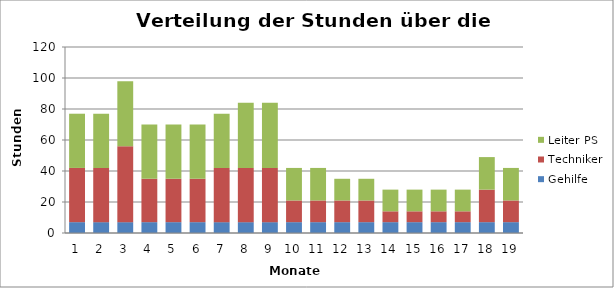
| Category | Gehilfe | Techniker | Leiter PS |
|---|---|---|---|
| 0 | 6.996 | 34.981 | 34.981 |
| 1 | 6.996 | 34.981 | 34.981 |
| 2 | 6.996 | 48.974 | 41.977 |
| 3 | 6.996 | 27.985 | 34.981 |
| 4 | 6.996 | 27.985 | 34.981 |
| 5 | 6.996 | 27.985 | 34.981 |
| 6 | 6.996 | 34.981 | 34.981 |
| 7 | 6.996 | 34.981 | 41.977 |
| 8 | 6.996 | 34.981 | 41.977 |
| 9 | 6.996 | 13.992 | 20.989 |
| 10 | 6.996 | 13.992 | 20.989 |
| 11 | 6.996 | 13.992 | 13.992 |
| 12 | 6.996 | 13.992 | 13.992 |
| 13 | 6.996 | 6.996 | 13.992 |
| 14 | 6.996 | 6.996 | 13.992 |
| 15 | 6.996 | 6.996 | 13.992 |
| 16 | 6.996 | 6.996 | 13.992 |
| 17 | 6.996 | 20.989 | 20.989 |
| 18 | 6.996 | 13.992 | 20.989 |